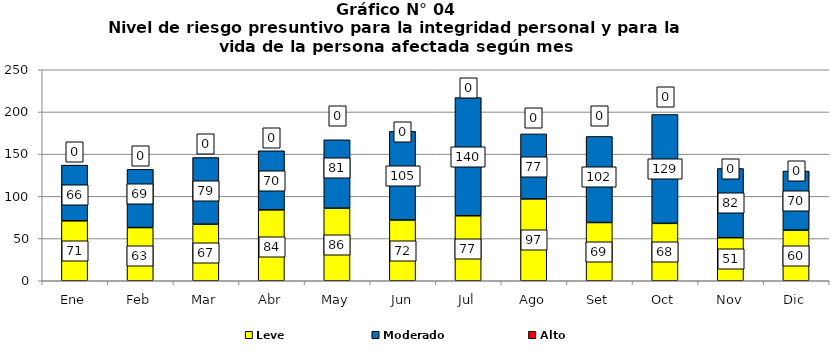
| Category | Leve | Moderado | Alto |
|---|---|---|---|
| Ene | 71 | 66 | 0 |
| Feb | 63 | 69 | 0 |
| Mar | 67 | 79 | 0 |
| Abr | 84 | 70 | 0 |
| May | 86 | 81 | 0 |
| Jun | 72 | 105 | 0 |
| Jul | 77 | 140 | 0 |
| Ago | 97 | 77 | 0 |
| Set | 69 | 102 | 0 |
| Oct | 68 | 129 | 0 |
| Nov | 51 | 82 | 0 |
| Dic | 60 | 70 | 0 |